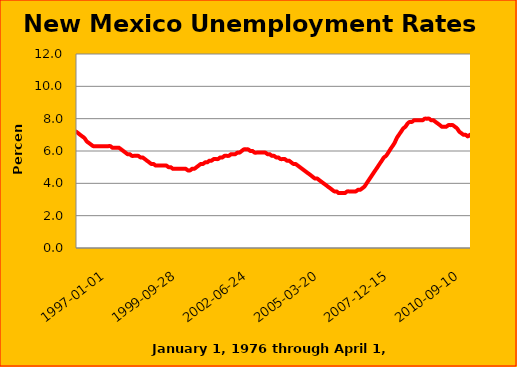
| Category | VALUE |
|---|---|
| 27760.0 | 8.9 |
| 27791.0 | 8.8 |
| 27820.0 | 8.7 |
| 27851.0 | 8.6 |
| 27881.0 | 8.6 |
| 27912.0 | 8.6 |
| 27942.0 | 8.6 |
| 27973.0 | 8.7 |
| 28004.0 | 8.7 |
| 28034.0 | 8.7 |
| 28065.0 | 8.7 |
| 28095.0 | 8.6 |
| 28126.0 | 8.5 |
| 28157.0 | 8.3 |
| 28185.0 | 8.2 |
| 28216.0 | 8 |
| 28246.0 | 7.8 |
| 28277.0 | 7.7 |
| 28307.0 | 7.6 |
| 28338.0 | 7.4 |
| 28369.0 | 7.3 |
| 28399.0 | 7.1 |
| 28430.0 | 6.9 |
| 28460.0 | 6.8 |
| 28491.0 | 6.6 |
| 28522.0 | 6.5 |
| 28550.0 | 6.4 |
| 28581.0 | 6.3 |
| 28611.0 | 6.2 |
| 28642.0 | 6.2 |
| 28672.0 | 6.2 |
| 28703.0 | 6.3 |
| 28734.0 | 6.3 |
| 28764.0 | 6.3 |
| 28795.0 | 6.3 |
| 28825.0 | 6.4 |
| 28856.0 | 6.4 |
| 28887.0 | 6.4 |
| 28915.0 | 6.4 |
| 28946.0 | 6.4 |
| 28976.0 | 6.5 |
| 29007.0 | 6.5 |
| 29037.0 | 6.6 |
| 29068.0 | 6.7 |
| 29099.0 | 6.7 |
| 29129.0 | 6.7 |
| 29160.0 | 6.6 |
| 29190.0 | 6.6 |
| 29221.0 | 6.7 |
| 29252.0 | 6.9 |
| 29281.0 | 7.2 |
| 29312.0 | 7.5 |
| 29342.0 | 7.7 |
| 29373.0 | 7.9 |
| 29403.0 | 7.9 |
| 29434.0 | 7.9 |
| 29465.0 | 7.9 |
| 29495.0 | 7.8 |
| 29526.0 | 7.7 |
| 29556.0 | 7.6 |
| 29587.0 | 7.4 |
| 29618.0 | 7.3 |
| 29646.0 | 7.2 |
| 29677.0 | 7.2 |
| 29707.0 | 7.2 |
| 29738.0 | 7.2 |
| 29768.0 | 7.2 |
| 29799.0 | 7.3 |
| 29830.0 | 7.5 |
| 29860.0 | 7.6 |
| 29891.0 | 7.8 |
| 29921.0 | 8 |
| 29952.0 | 8.2 |
| 29983.0 | 8.3 |
| 30011.0 | 8.5 |
| 30042.0 | 8.6 |
| 30072.0 | 8.7 |
| 30103.0 | 8.8 |
| 30133.0 | 8.9 |
| 30164.0 | 9.1 |
| 30195.0 | 9.3 |
| 30225.0 | 9.5 |
| 30256.0 | 9.7 |
| 30286.0 | 9.9 |
| 30317.0 | 10 |
| 30348.0 | 10 |
| 30376.0 | 10 |
| 30407.0 | 9.9 |
| 30437.0 | 9.8 |
| 30468.0 | 9.7 |
| 30498.0 | 9.6 |
| 30529.0 | 9.3 |
| 30560.0 | 9.1 |
| 30590.0 | 8.9 |
| 30621.0 | 8.6 |
| 30651.0 | 8.4 |
| 30682.0 | 8.3 |
| 30713.0 | 8.1 |
| 30742.0 | 8 |
| 30773.0 | 7.9 |
| 30803.0 | 7.9 |
| 30834.0 | 7.8 |
| 30864.0 | 7.9 |
| 30895.0 | 7.9 |
| 30926.0 | 8 |
| 30956.0 | 8.1 |
| 30987.0 | 8.1 |
| 31017.0 | 8.2 |
| 31048.0 | 8.2 |
| 31079.0 | 8.3 |
| 31107.0 | 8.3 |
| 31138.0 | 8.4 |
| 31168.0 | 8.5 |
| 31199.0 | 8.6 |
| 31229.0 | 8.7 |
| 31260.0 | 8.8 |
| 31291.0 | 8.8 |
| 31321.0 | 8.8 |
| 31352.0 | 8.8 |
| 31382.0 | 8.8 |
| 31413.0 | 8.9 |
| 31444.0 | 8.9 |
| 31472.0 | 9 |
| 31503.0 | 9.1 |
| 31533.0 | 9.2 |
| 31564.0 | 9.3 |
| 31594.0 | 9.3 |
| 31625.0 | 9.4 |
| 31656.0 | 9.5 |
| 31686.0 | 9.5 |
| 31717.0 | 9.5 |
| 31747.0 | 9.5 |
| 31778.0 | 9.5 |
| 31809.0 | 9.4 |
| 31837.0 | 9.3 |
| 31868.0 | 9.2 |
| 31898.0 | 9 |
| 31929.0 | 8.9 |
| 31959.0 | 8.8 |
| 31990.0 | 8.7 |
| 32021.0 | 8.7 |
| 32051.0 | 8.7 |
| 32082.0 | 8.6 |
| 32112.0 | 8.4 |
| 32143.0 | 8.2 |
| 32174.0 | 8 |
| 32203.0 | 7.9 |
| 32234.0 | 7.8 |
| 32264.0 | 7.8 |
| 32295.0 | 7.7 |
| 32325.0 | 7.6 |
| 32356.0 | 7.5 |
| 32387.0 | 7.4 |
| 32417.0 | 7.3 |
| 32448.0 | 7.1 |
| 32478.0 | 7 |
| 32509.0 | 6.8 |
| 32540.0 | 6.7 |
| 32568.0 | 6.7 |
| 32599.0 | 6.7 |
| 32629.0 | 6.7 |
| 32660.0 | 6.7 |
| 32690.0 | 6.7 |
| 32721.0 | 6.7 |
| 32752.0 | 6.7 |
| 32782.0 | 6.8 |
| 32813.0 | 6.8 |
| 32843.0 | 6.7 |
| 32874.0 | 6.7 |
| 32905.0 | 6.7 |
| 32933.0 | 6.7 |
| 32964.0 | 6.6 |
| 32994.0 | 6.6 |
| 33025.0 | 6.6 |
| 33055.0 | 6.6 |
| 33086.0 | 6.7 |
| 33117.0 | 6.8 |
| 33147.0 | 6.9 |
| 33178.0 | 7.1 |
| 33208.0 | 7.2 |
| 33239.0 | 7.3 |
| 33270.0 | 7.3 |
| 33298.0 | 7.4 |
| 33329.0 | 7.3 |
| 33359.0 | 7.3 |
| 33390.0 | 7.2 |
| 33420.0 | 7.1 |
| 33451.0 | 7.1 |
| 33482.0 | 7.1 |
| 33512.0 | 7.2 |
| 33543.0 | 7.3 |
| 33573.0 | 7.4 |
| 33604.0 | 7.5 |
| 33635.0 | 7.6 |
| 33664.0 | 7.6 |
| 33695.0 | 7.5 |
| 33725.0 | 7.5 |
| 33756.0 | 7.4 |
| 33786.0 | 7.4 |
| 33817.0 | 7.3 |
| 33848.0 | 7.3 |
| 33878.0 | 7.3 |
| 33909.0 | 7.4 |
| 33939.0 | 7.4 |
| 33970.0 | 7.4 |
| 34001.0 | 7.4 |
| 34029.0 | 7.4 |
| 34060.0 | 7.4 |
| 34090.0 | 7.3 |
| 34121.0 | 7.2 |
| 34151.0 | 7.1 |
| 34182.0 | 7 |
| 34213.0 | 6.9 |
| 34243.0 | 6.9 |
| 34274.0 | 6.9 |
| 34304.0 | 6.8 |
| 34335.0 | 6.8 |
| 34366.0 | 6.8 |
| 34394.0 | 6.8 |
| 34425.0 | 6.7 |
| 34455.0 | 6.6 |
| 34486.0 | 6.6 |
| 34516.0 | 6.6 |
| 34547.0 | 6.6 |
| 34578.0 | 6.6 |
| 34608.0 | 6.6 |
| 34639.0 | 6.5 |
| 34669.0 | 6.5 |
| 34700.0 | 6.5 |
| 34731.0 | 6.5 |
| 34759.0 | 6.6 |
| 34790.0 | 6.6 |
| 34820.0 | 6.7 |
| 34851.0 | 6.8 |
| 34881.0 | 6.8 |
| 34912.0 | 6.9 |
| 34943.0 | 7 |
| 34973.0 | 7.1 |
| 35004.0 | 7.2 |
| 35034.0 | 7.2 |
| 35065.0 | 7.3 |
| 35096.0 | 7.4 |
| 35125.0 | 7.4 |
| 35156.0 | 7.4 |
| 35186.0 | 7.4 |
| 35217.0 | 7.4 |
| 35247.0 | 7.4 |
| 35278.0 | 7.4 |
| 35309.0 | 7.3 |
| 35339.0 | 7.3 |
| 35370.0 | 7.3 |
| 35400.0 | 7.2 |
| 35431.0 | 7.2 |
| 35462.0 | 7.1 |
| 35490.0 | 7 |
| 35521.0 | 6.9 |
| 35551.0 | 6.8 |
| 35582.0 | 6.6 |
| 35612.0 | 6.5 |
| 35643.0 | 6.4 |
| 35674.0 | 6.3 |
| 35704.0 | 6.3 |
| 35735.0 | 6.3 |
| 35765.0 | 6.3 |
| 35796.0 | 6.3 |
| 35827.0 | 6.3 |
| 35855.0 | 6.3 |
| 35886.0 | 6.3 |
| 35916.0 | 6.3 |
| 35947.0 | 6.2 |
| 35977.0 | 6.2 |
| 36008.0 | 6.2 |
| 36039.0 | 6.2 |
| 36069.0 | 6.1 |
| 36100.0 | 6 |
| 36130.0 | 5.9 |
| 36161.0 | 5.8 |
| 36192.0 | 5.8 |
| 36220.0 | 5.7 |
| 36251.0 | 5.7 |
| 36281.0 | 5.7 |
| 36312.0 | 5.7 |
| 36342.0 | 5.6 |
| 36373.0 | 5.6 |
| 36404.0 | 5.5 |
| 36434.0 | 5.4 |
| 36465.0 | 5.3 |
| 36495.0 | 5.2 |
| 36526.0 | 5.2 |
| 36557.0 | 5.1 |
| 36586.0 | 5.1 |
| 36617.0 | 5.1 |
| 36647.0 | 5.1 |
| 36678.0 | 5.1 |
| 36708.0 | 5.1 |
| 36739.0 | 5 |
| 36770.0 | 5 |
| 36800.0 | 4.9 |
| 36831.0 | 4.9 |
| 36861.0 | 4.9 |
| 36892.0 | 4.9 |
| 36923.0 | 4.9 |
| 36951.0 | 4.9 |
| 36982.0 | 4.9 |
| 37012.0 | 4.8 |
| 37043.0 | 4.8 |
| 37073.0 | 4.9 |
| 37104.0 | 4.9 |
| 37135.0 | 5 |
| 37165.0 | 5.1 |
| 37196.0 | 5.2 |
| 37226.0 | 5.2 |
| 37257.0 | 5.3 |
| 37288.0 | 5.3 |
| 37316.0 | 5.4 |
| 37347.0 | 5.4 |
| 37377.0 | 5.5 |
| 37408.0 | 5.5 |
| 37438.0 | 5.5 |
| 37469.0 | 5.6 |
| 37500.0 | 5.6 |
| 37530.0 | 5.7 |
| 37561.0 | 5.7 |
| 37591.0 | 5.7 |
| 37622.0 | 5.8 |
| 37653.0 | 5.8 |
| 37681.0 | 5.8 |
| 37712.0 | 5.9 |
| 37742.0 | 5.9 |
| 37773.0 | 6 |
| 37803.0 | 6.1 |
| 37834.0 | 6.1 |
| 37865.0 | 6.1 |
| 37895.0 | 6 |
| 37926.0 | 6 |
| 37956.0 | 5.9 |
| 37987.0 | 5.9 |
| 38018.0 | 5.9 |
| 38047.0 | 5.9 |
| 38078.0 | 5.9 |
| 38108.0 | 5.9 |
| 38139.0 | 5.8 |
| 38169.0 | 5.8 |
| 38200.0 | 5.7 |
| 38231.0 | 5.7 |
| 38261.0 | 5.6 |
| 38292.0 | 5.6 |
| 38322.0 | 5.5 |
| 38353.0 | 5.5 |
| 38384.0 | 5.5 |
| 38412.0 | 5.4 |
| 38443.0 | 5.4 |
| 38473.0 | 5.3 |
| 38504.0 | 5.2 |
| 38534.0 | 5.2 |
| 38565.0 | 5.1 |
| 38596.0 | 5 |
| 38626.0 | 4.9 |
| 38657.0 | 4.8 |
| 38687.0 | 4.7 |
| 38718.0 | 4.6 |
| 38749.0 | 4.5 |
| 38777.0 | 4.4 |
| 38808.0 | 4.3 |
| 38838.0 | 4.3 |
| 38869.0 | 4.2 |
| 38899.0 | 4.1 |
| 38930.0 | 4 |
| 38961.0 | 3.9 |
| 38991.0 | 3.8 |
| 39022.0 | 3.7 |
| 39052.0 | 3.6 |
| 39083.0 | 3.5 |
| 39114.0 | 3.5 |
| 39142.0 | 3.4 |
| 39173.0 | 3.4 |
| 39203.0 | 3.4 |
| 39234.0 | 3.4 |
| 39264.0 | 3.5 |
| 39295.0 | 3.5 |
| 39326.0 | 3.5 |
| 39356.0 | 3.5 |
| 39387.0 | 3.5 |
| 39417.0 | 3.6 |
| 39448.0 | 3.6 |
| 39479.0 | 3.7 |
| 39508.0 | 3.8 |
| 39539.0 | 4 |
| 39569.0 | 4.2 |
| 39600.0 | 4.4 |
| 39630.0 | 4.6 |
| 39661.0 | 4.8 |
| 39692.0 | 5 |
| 39722.0 | 5.2 |
| 39753.0 | 5.4 |
| 39783.0 | 5.6 |
| 39814.0 | 5.7 |
| 39845.0 | 5.9 |
| 39873.0 | 6.1 |
| 39904.0 | 6.3 |
| 39934.0 | 6.5 |
| 39965.0 | 6.8 |
| 39995.0 | 7 |
| 40026.0 | 7.2 |
| 40057.0 | 7.4 |
| 40087.0 | 7.5 |
| 40118.0 | 7.7 |
| 40148.0 | 7.8 |
| 40179.0 | 7.8 |
| 40210.0 | 7.9 |
| 40238.0 | 7.9 |
| 40269.0 | 7.9 |
| 40299.0 | 7.9 |
| 40330.0 | 7.9 |
| 40360.0 | 8 |
| 40391.0 | 8 |
| 40422.0 | 8 |
| 40452.0 | 7.9 |
| 40483.0 | 7.9 |
| 40513.0 | 7.8 |
| 40544.0 | 7.7 |
| 40575.0 | 7.6 |
| 40603.0 | 7.5 |
| 40634.0 | 7.5 |
| 40664.0 | 7.5 |
| 40695.0 | 7.6 |
| 40725.0 | 7.6 |
| 40756.0 | 7.6 |
| 40787.0 | 7.5 |
| 40817.0 | 7.4 |
| 40848.0 | 7.2 |
| 40878.0 | 7.1 |
| 40909.0 | 7 |
| 40940.0 | 7 |
| 40969.0 | 6.9 |
| 41000.0 | 7 |
| 41030.0 | 7 |
| 41061.0 | 7 |
| 41091.0 | 7 |
| 41122.0 | 7 |
| 41153.0 | 6.9 |
| 41183.0 | 6.8 |
| 41214.0 | 6.7 |
| 41244.0 | 6.6 |
| 41275.0 | 6.6 |
| 41306.0 | 6.8 |
| 41334.0 | 6.9 |
| 41365.0 | 6.7 |